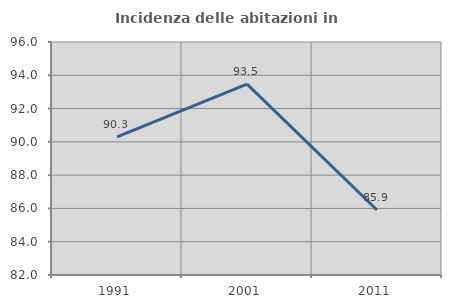
| Category | Incidenza delle abitazioni in proprietà  |
|---|---|
| 1991.0 | 90.302 |
| 2001.0 | 93.466 |
| 2011.0 | 85.907 |